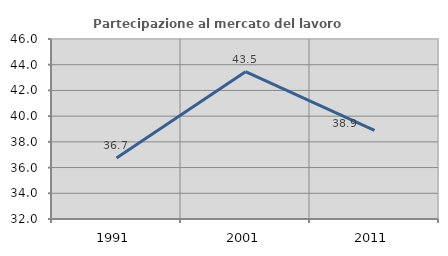
| Category | Partecipazione al mercato del lavoro  femminile |
|---|---|
| 1991.0 | 36.744 |
| 2001.0 | 43.455 |
| 2011.0 | 38.889 |